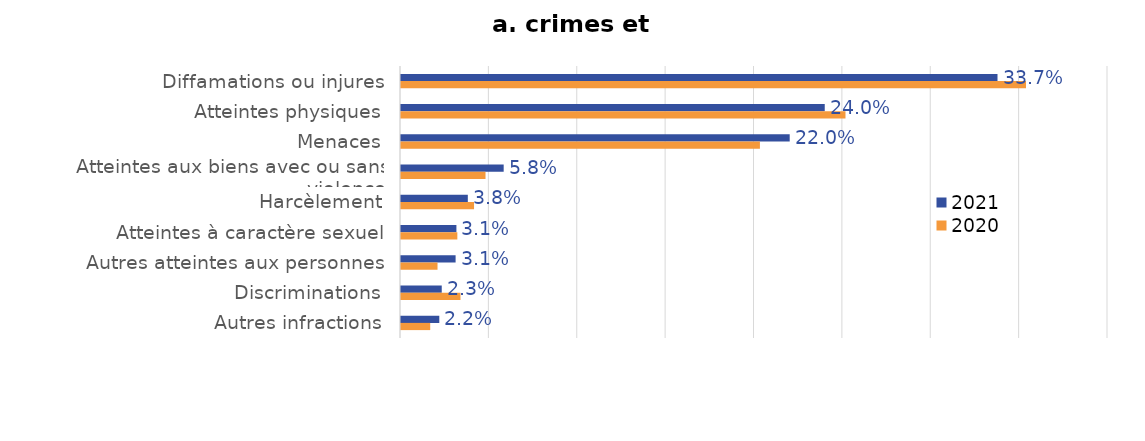
| Category | 2021 | 2020 |
|---|---|---|
| Diffamations ou injures | 0.337 | 0.354 |
| Atteintes physiques | 0.24 | 0.251 |
| Menaces | 0.22 | 0.203 |
| Atteintes aux biens avec ou sans violence | 0.058 | 0.048 |
| Harcèlement | 0.038 | 0.041 |
| Atteintes à caractère sexuel | 0.031 | 0.032 |
| Autres atteintes aux personnes | 0.031 | 0.021 |
| Discriminations | 0.023 | 0.034 |
| Autres infractions | 0.022 | 0.017 |